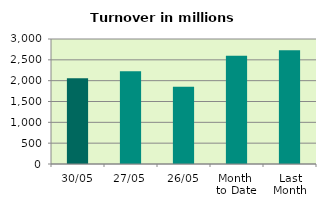
| Category | Series 0 |
|---|---|
| 30/05 | 2060.955 |
| 27/05 | 2228.772 |
| 26/05 | 1851.872 |
| Month 
to Date | 2599.121 |
| Last
Month | 2727.753 |